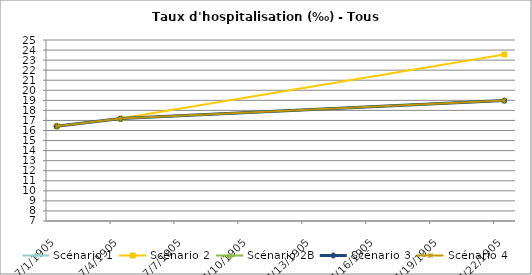
| Category | Scénario 1 | Scénario 2 | Scénario 2B | Scénario 3 | Scénario 4 |
|---|---|---|---|---|---|
| 2009.0 | 16.422 | 16.422 | 16.422 | 16.422 | 16.422 |
| 2012.0 | 17.182 | 17.182 | 17.182 | 17.182 | 17.182 |
| 2030.0 | 18.983 | 23.561 | 18.983 | 18.983 | 18.983 |